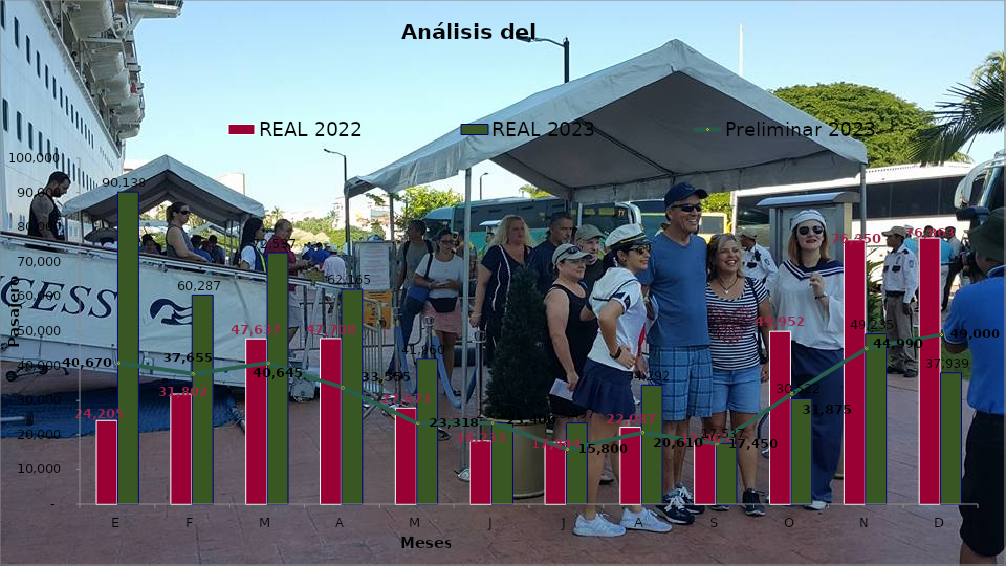
| Category | REAL 2022 | REAL 2023 |
|---|---|---|
| E | 24205 | 90138 |
| F | 31802 | 60287 |
| M | 47637 | 72537 |
| A | 47708 | 62165 |
| M | 27673 | 41960 |
| J | 18233 | 23500 |
| J | 17844 | 23497 |
| A | 22087 | 34292 |
| S | 17965 | 17537 |
| O | 49952 | 30522 |
| N | 76350 | 49235 |
| D | 76863 | 37939 |